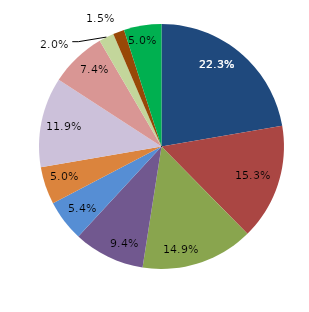
| Category | Series 0 |
|---|---|
| قبل الدخول | 22.277 |
| -1 | 15.347 |
| 1 | 14.851 |
| 2 | 9.406 |
| 3 | 5.446 |
| 4 | 4.95 |
|  5 - 9 | 11.881 |
|  10 - 14 | 7.426 |
|  15 - 19 | 1.98 |
|  20 - 24 | 1.485 |
| 25 + | 4.95 |